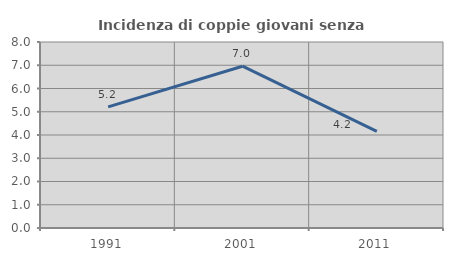
| Category | Incidenza di coppie giovani senza figli |
|---|---|
| 1991.0 | 5.211 |
| 2001.0 | 6.959 |
| 2011.0 | 4.16 |